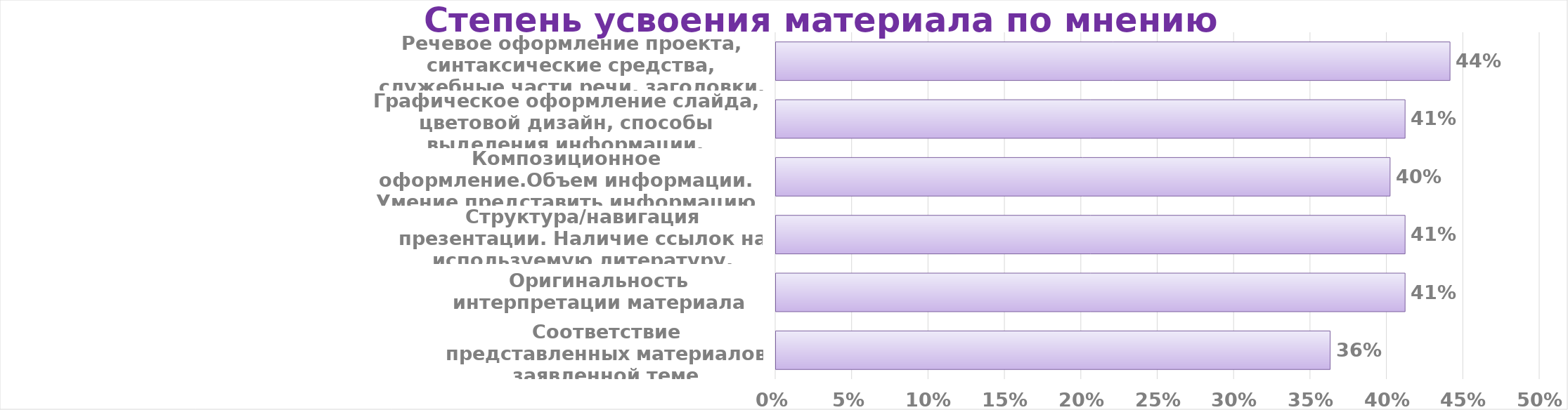
| Category | Series 0 |
|---|---|
| Соответствие представленных материалов заявленной теме | 0.363 |
| Оригинальность интерпретации материала | 0.412 |
| Структура/навигация презентации. Наличие ссылок на используемую литературу. | 0.412 |
| Композиционное оформление.Объем информации. Умение представить информацию разных видов (текстовый материал, картинки, графики, схемы). | 0.402 |
| Графическое оформление слайда, цветовой дизайн, способы выделения информации, анимационные эффекты, шрифты | 0.412 |
| Речевое оформление проекта, синтаксические средства, служебные части речи, заголовки. | 0.441 |